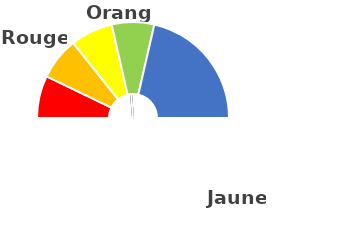
| Category | Series 1 |
|---|---|
| nan | 3.319 |
| 3.318521851622701 | 0.01 |
| nan | 10.671 |